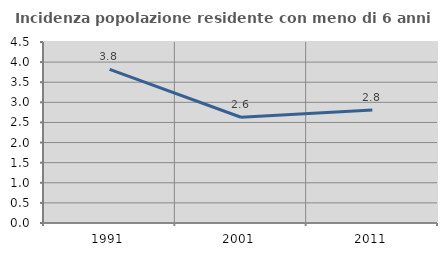
| Category | Incidenza popolazione residente con meno di 6 anni |
|---|---|
| 1991.0 | 3.818 |
| 2001.0 | 2.629 |
| 2011.0 | 2.808 |